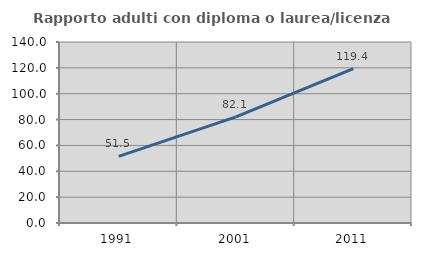
| Category | Rapporto adulti con diploma o laurea/licenza media  |
|---|---|
| 1991.0 | 51.534 |
| 2001.0 | 82.081 |
| 2011.0 | 119.394 |